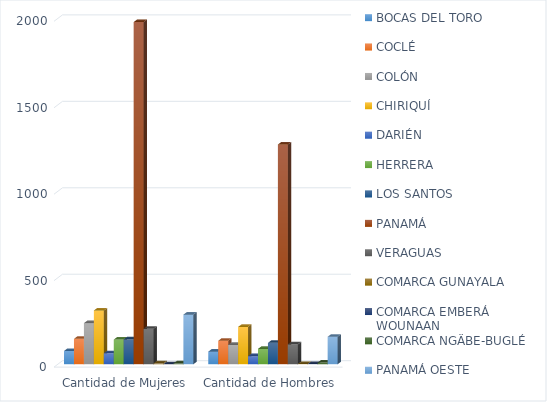
| Category | BOCAS DEL TORO | COCLÉ | COLÓN | CHIRIQUÍ | DARIÉN | HERRERA | LOS SANTOS | PANAMÁ | VERAGUAS | COMARCA GUNAYALA | COMARCA EMBERÁ WOUNAAN | COMARCA NGÄBE-BUGLÉ | PANAMÁ OESTE |
|---|---|---|---|---|---|---|---|---|---|---|---|---|---|
| Cantidad de Mujeres | 77 | 147 | 238 | 311 | 64 | 143 | 144 | 1979 | 205 | 5 | 0 | 5 | 287 |
| Cantidad de Hombres | 73 | 136 | 112 | 216 | 47 | 89 | 124 | 1271 | 115 | 1 | 1 | 10 | 159 |